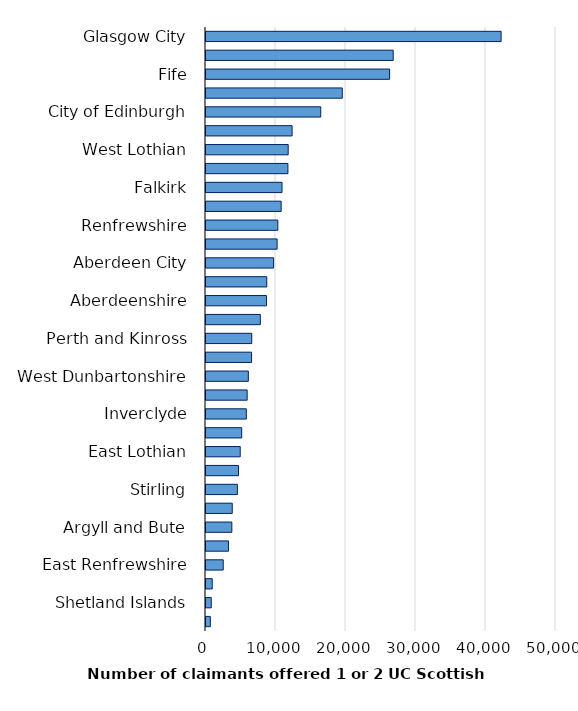
| Category | Series 0 |
|---|---|
| Glasgow City | 42160 |
| North Lanarkshire | 26740 |
| Fife | 26230 |
| South Lanarkshire | 19470 |
| City of Edinburgh | 16390 |
| Dundee City | 12300 |
| West Lothian | 11740 |
| North Ayrshire | 11700 |
| Falkirk | 10860 |
| Highland | 10740 |
| Renfrewshire | 10260 |
| East Ayrshire | 10160 |
| Aberdeen City | 9660 |
| Dumfries and Galloway | 8680 |
| Aberdeenshire | 8640 |
| South Ayrshire | 7760 |
| Perth and Kinross | 6540 |
| Angus | 6510 |
| West Dunbartonshire | 6050 |
| Scottish Borders | 5880 |
| Inverclyde | 5760 |
| Midlothian | 5100 |
| East Lothian | 4890 |
| Moray | 4640 |
| Stirling | 4480 |
| Clackmannanshire | 3750 |
| Argyll and Bute | 3690 |
| East Dunbartonshire | 3210 |
| East Renfrewshire | 2460 |
| Na h-Eileanan Siar | 890 |
| Shetland Islands | 750 |
| Orkney Islands | 620 |